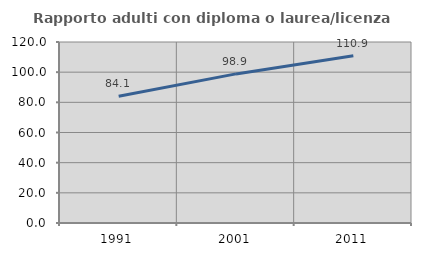
| Category | Rapporto adulti con diploma o laurea/licenza media  |
|---|---|
| 1991.0 | 84.058 |
| 2001.0 | 98.851 |
| 2011.0 | 110.87 |